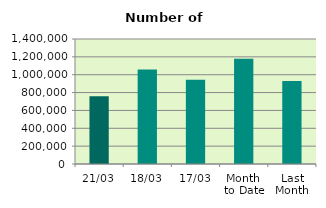
| Category | Series 0 |
|---|---|
| 21/03 | 759030 |
| 18/03 | 1058414 |
| 17/03 | 944622 |
| Month 
to Date | 1177518.267 |
| Last
Month | 928647.7 |